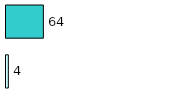
| Category | Series 0 | Series 1 |
|---|---|---|
| 0 | 4 | 64 |